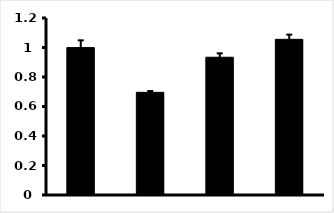
| Category | Series 0 |
|---|---|
| 0 | 0.999 |
| 1 | 0.696 |
| 2 | 0.934 |
| 3 | 1.055 |